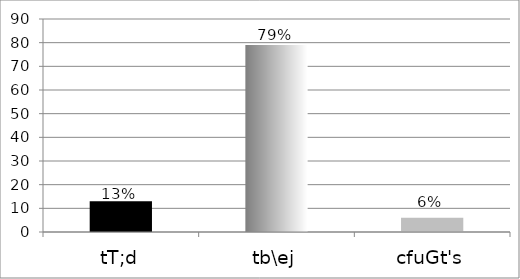
| Category | Series 0 |
|---|---|
| tT;d | 13 |
| tb\ej | 79 |
| cfuGt's | 6 |